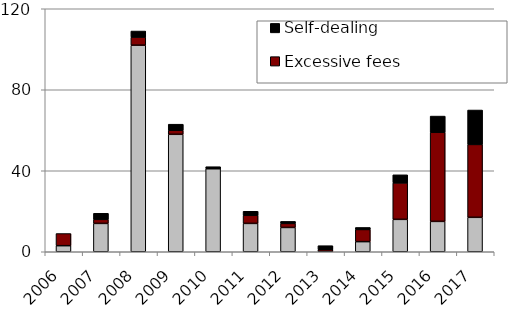
| Category | Inappropriate investment choices | Excessive fees | Self-dealing |
|---|---|---|---|
| 2006.0 | 3 | 6 | 0 |
| 2007.0 | 14 | 2 | 3 |
| 2008.0 | 102 | 4 | 3 |
| 2009.0 | 58 | 2 | 3 |
| 2010.0 | 41 | 0 | 1 |
| 2011.0 | 14 | 4 | 2 |
| 2012.0 | 12 | 2 | 1 |
| 2013.0 | 0 | 1 | 2 |
| 2014.0 | 5 | 6 | 1 |
| 2015.0 | 16 | 18 | 4 |
| 2016.0 | 15 | 44 | 8 |
| 2017.0 | 17 | 36 | 17 |